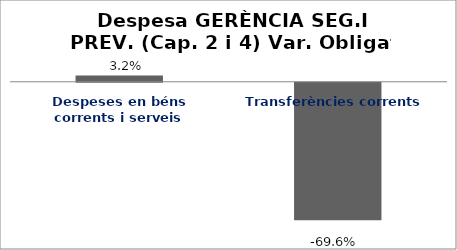
| Category | Series 0 |
|---|---|
| Despeses en béns corrents i serveis | 0.032 |
| Transferències corrents | -0.696 |